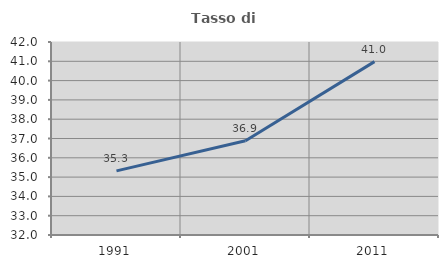
| Category | Tasso di occupazione   |
|---|---|
| 1991.0 | 35.321 |
| 2001.0 | 36.88 |
| 2011.0 | 40.984 |